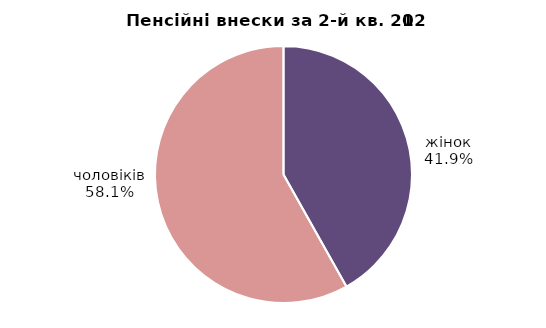
| Category | Series 0 |
|---|---|
| жінок | 31.617 |
| чоловіків | 43.926 |